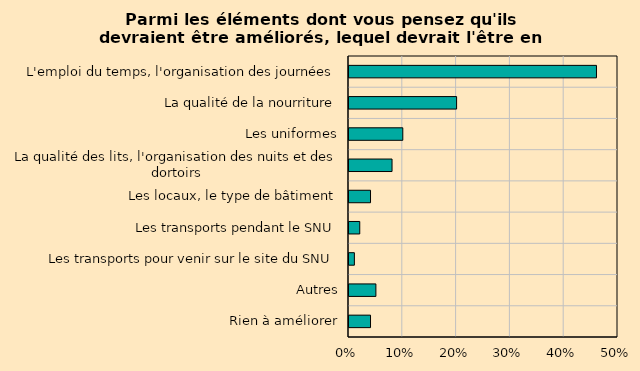
| Category | % tot |
|---|---|
| Rien à améliorer | 0.04 |
| Autres | 0.05 |
| Les transports pour venir sur le site du SNU | 0.01 |
| Les transports pendant le SNU | 0.02 |
| Les locaux, le type de bâtiment | 0.04 |
| La qualité des lits, l'organisation des nuits et des dortoirs | 0.08 |
| Les uniformes | 0.1 |
| La qualité de la nourriture | 0.2 |
| L'emploi du temps, l'organisation des journées | 0.46 |